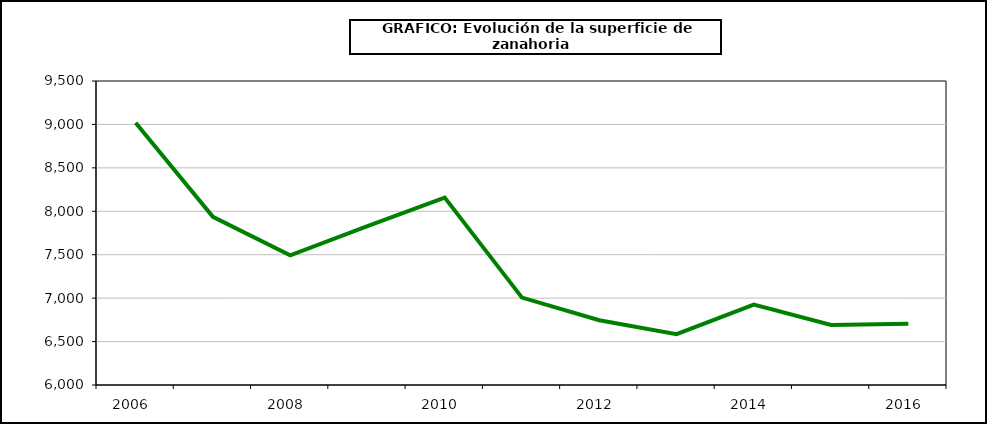
| Category | superficie |
|---|---|
| 2006.0 | 9019 |
| 2007.0 | 7936 |
| 2008.0 | 7492 |
| 2009.0 | 7828 |
| 2010.0 | 8157 |
| 2011.0 | 7006 |
| 2012.0 | 6745 |
| 2013.0 | 6586 |
| 2014.0 | 6926 |
| 2015.0 | 6692 |
| 2016.0 | 6705 |